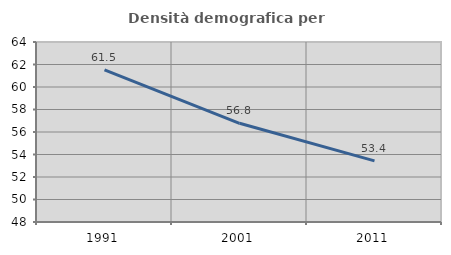
| Category | Densità demografica |
|---|---|
| 1991.0 | 61.526 |
| 2001.0 | 56.774 |
| 2011.0 | 53.433 |